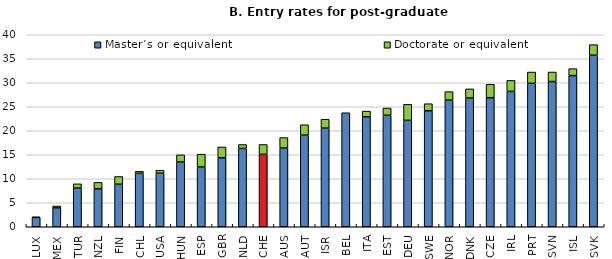
| Category | Master’s or equivalent | Doctorate or equivalent |
|---|---|---|
| LUX | 1.946 | 0.086 |
| MEX | 3.925 | 0.393 |
| TUR | 8.055 | 0.892 |
| NZL | 7.919 | 1.322 |
| FIN | 8.861 | 1.61 |
| CHL | 11.13 | 0.415 |
| USA | 11.146 | 0.633 |
| HUN | 13.477 | 1.509 |
| ESP | 12.444 | 2.679 |
| GBR | 14.366 | 2.253 |
| NLD | 16.318 | 0.812 |
| CHE | 15.083 | 2.063 |
| AUS | 16.394 | 2.188 |
| AUT | 19.084 | 2.17 |
| ISR | 20.553 | 1.847 |
| BEL | 23.756 | 0 |
| ITA | 22.901 | 1.19 |
| EST | 23.227 | 1.509 |
| DEU | 22.169 | 3.337 |
| SWE | 24.152 | 1.484 |
| NOR | 26.378 | 1.771 |
| DNK | 26.811 | 1.91 |
| CZE | 26.877 | 2.813 |
| IRL | 28.2 | 2.29 |
| PRT | 29.889 | 2.346 |
| SVN | 30.247 | 1.99 |
| ISL | 31.489 | 1.452 |
| SVK | 35.733 | 2.206 |